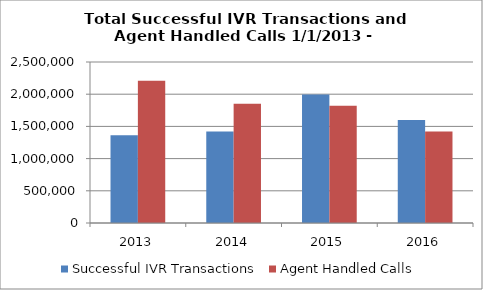
| Category | Successful IVR Transactions | Agent Handled Calls |
|---|---|---|
| 2013 | 1361193 | 2210492 |
| 2014 | 1418915 | 1850779 |
| 2015 | 1994491 | 1822546 |
| 2016 | 1598190 | 1419129 |